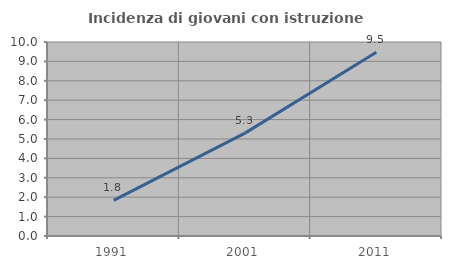
| Category | Incidenza di giovani con istruzione universitaria |
|---|---|
| 1991.0 | 1.835 |
| 2001.0 | 5.303 |
| 2011.0 | 9.467 |